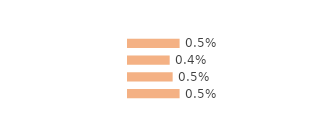
| Category | Series 0 |
|---|---|
| Modeste | 0.005 |
| Médian inférieur | 0.004 |
| Médian supérieur | 0.004 |
| Aisé | 0.005 |